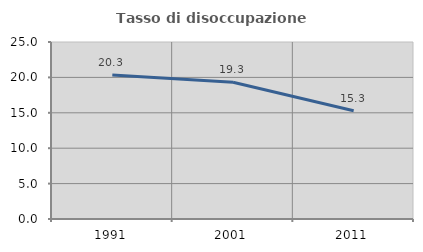
| Category | Tasso di disoccupazione giovanile  |
|---|---|
| 1991.0 | 20.339 |
| 2001.0 | 19.318 |
| 2011.0 | 15.294 |